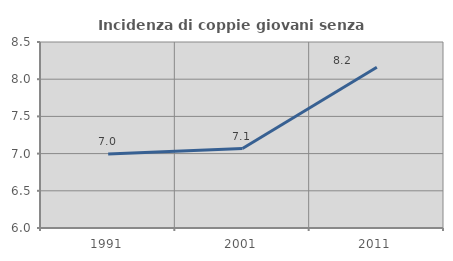
| Category | Incidenza di coppie giovani senza figli |
|---|---|
| 1991.0 | 6.994 |
| 2001.0 | 7.068 |
| 2011.0 | 8.16 |